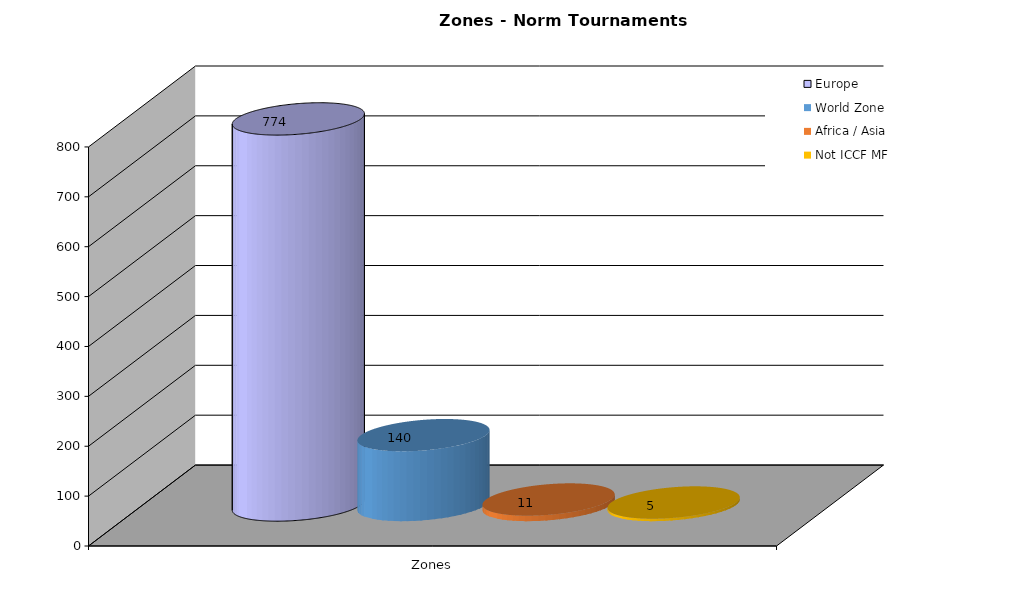
| Category | Europe | World Zone | Africa / Asia | Not ICCF MF |
|---|---|---|---|---|
| 0 | 774 | 140 | 11 | 5 |